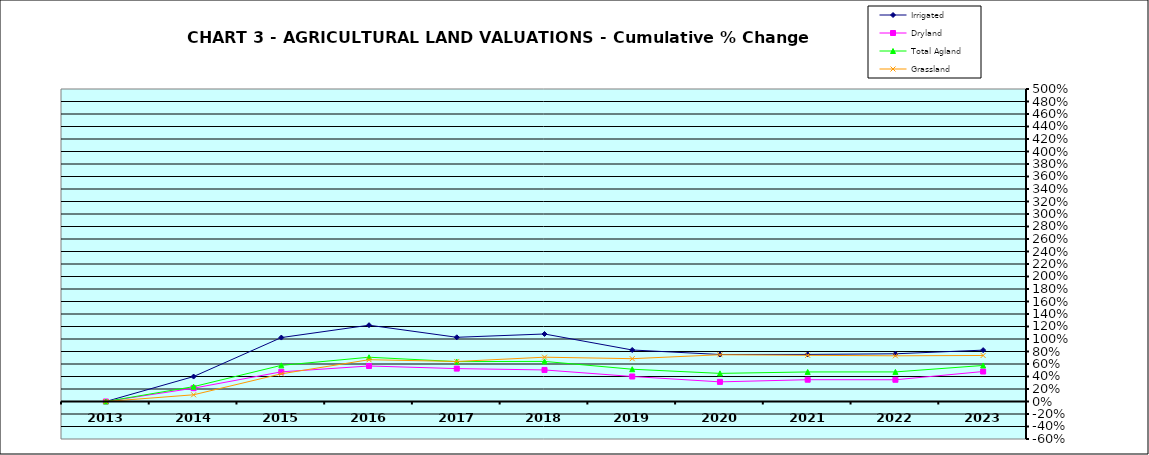
| Category | Irrigated | Dryland | Total Agland | Grassland |
|---|---|---|---|---|
| 2013.0 | 0 | 0 | 0 | 0 |
| 2014.0 | 0.399 | 0.213 | 0.238 | 0.107 |
| 2015.0 | 1.023 | 0.475 | 0.578 | 0.443 |
| 2016.0 | 1.221 | 0.568 | 0.708 | 0.669 |
| 2017.0 | 1.027 | 0.526 | 0.638 | 0.64 |
| 2018.0 | 1.08 | 0.505 | 0.642 | 0.709 |
| 2019.0 | 0.824 | 0.4 | 0.516 | 0.685 |
| 2020.0 | 0.752 | 0.314 | 0.45 | 0.748 |
| 2021.0 | 0.753 | 0.349 | 0.473 | 0.739 |
| 2022.0 | 0.763 | 0.348 | 0.473 | 0.731 |
| 2023.0 | 0.822 | 0.48 | 0.577 | 0.736 |